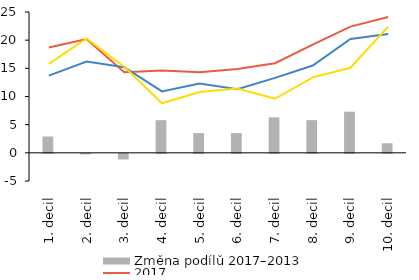
| Category | Změna podílů 2017–2013  |
|---|---|
| 0 | 2.9 |
| 1 | -0.1 |
| 2 | -1 |
| 3 | 5.8 |
| 4 | 3.5 |
| 5 | 3.5 |
| 6 | 6.3 |
| 7 | 5.8 |
| 8 | 7.3 |
| 9 | 1.7 |